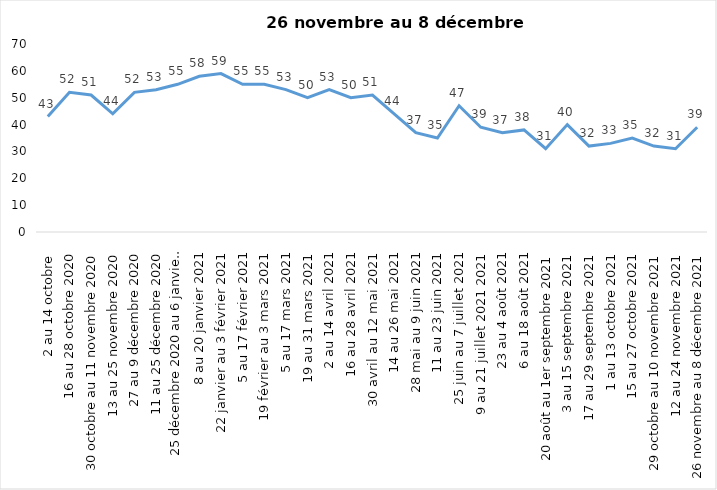
| Category | Toujours aux trois mesures |
|---|---|
| 2 au 14 octobre  | 43 |
| 16 au 28 octobre 2020 | 52 |
| 30 octobre au 11 novembre 2020 | 51 |
| 13 au 25 novembre 2020 | 44 |
| 27 au 9 décembre 2020 | 52 |
| 11 au 25 décembre 2020 | 53 |
| 25 décembre 2020 au 6 janvier 2021 | 55 |
| 8 au 20 janvier 2021 | 58 |
| 22 janvier au 3 février 2021 | 59 |
| 5 au 17 février 2021 | 55 |
| 19 février au 3 mars 2021 | 55 |
| 5 au 17 mars 2021 | 53 |
| 19 au 31 mars 2021 | 50 |
| 2 au 14 avril 2021 | 53 |
| 16 au 28 avril 2021 | 50 |
| 30 avril au 12 mai 2021 | 51 |
| 14 au 26 mai 2021 | 44 |
| 28 mai au 9 juin 2021 | 37 |
| 11 au 23 juin 2021 | 35 |
| 25 juin au 7 juillet 2021 | 47 |
| 9 au 21 juillet 2021 2021 | 39 |
| 23 au 4 août 2021 | 37 |
| 6 au 18 août 2021 | 38 |
| 20 août au 1er septembre 2021 | 31 |
| 3 au 15 septembre 2021 | 40 |
| 17 au 29 septembre 2021 | 32 |
| 1 au 13 octobre 2021 | 33 |
| 15 au 27 octobre 2021 | 35 |
| 29 octobre au 10 novembre 2021 | 32 |
| 12 au 24 novembre 2021 | 31 |
| 26 novembre au 8 décembre 2021 | 39 |